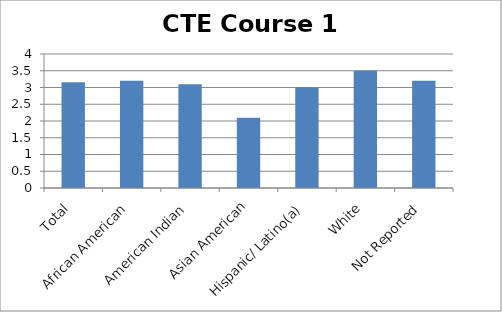
| Category | CTE Course 1 GPA |
|---|---|
| Total | 3.16 |
| African American | 3.2 |
| American Indian | 3.1 |
| Asian American | 2.1 |
| Hispanic/ Latino(a) | 3 |
| White | 3.5 |
| Not Reported | 3.2 |